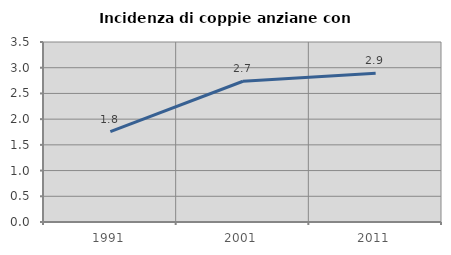
| Category | Incidenza di coppie anziane con figli |
|---|---|
| 1991.0 | 1.758 |
| 2001.0 | 2.736 |
| 2011.0 | 2.893 |